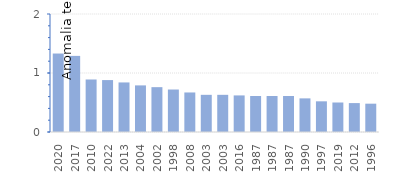
| Category | ANUAL |
|---|---|
| 2020.0 | 1.33 |
| 2017.0 | 1.29 |
| 2010.0 | 0.89 |
| 2022.0 | 0.88 |
| 2013.0 | 0.84 |
| 2004.0 | 0.79 |
| 2002.0 | 0.76 |
| 1998.0 | 0.72 |
| 2008.0 | 0.67 |
| 2003.0 | 0.63 |
| 2003.0 | 0.63 |
| 2016.0 | 0.62 |
| 1987.0 | 0.61 |
| 1987.0 | 0.61 |
| 1987.0 | 0.61 |
| 1990.0 | 0.57 |
| 1997.0 | 0.52 |
| 2019.0 | 0.5 |
| 2012.0 | 0.49 |
| 1996.0 | 0.48 |